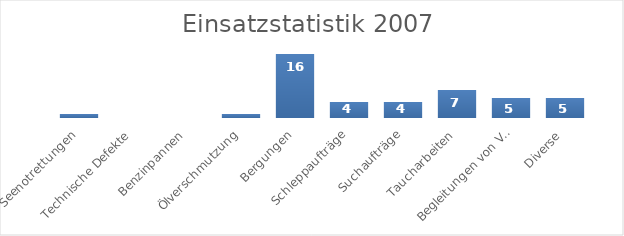
| Category | Series 0 |
|---|---|
| Seenotrettungen | 1 |
| Technische Defekte | 0 |
| Benzinpannen | 0 |
| Ölverschmutzung | 1 |
| Bergungen | 16 |
| Schleppaufträge | 4 |
| Suchaufträge | 4 |
| Taucharbeiten | 7 |
| Begleitungen von Veranstaltungen | 5 |
| Diverse | 5 |